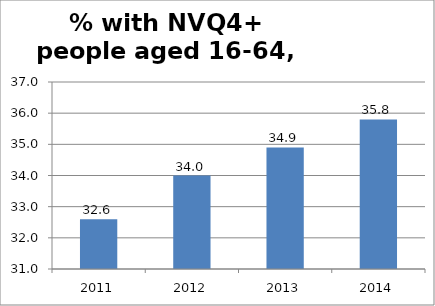
| Category | % with NVQ4+ - aged 16-64 |
|---|---|
| 2011.0 | 32.6 |
| 2012.0 | 34 |
| 2013.0 | 34.9 |
| 2014.0 | 35.8 |